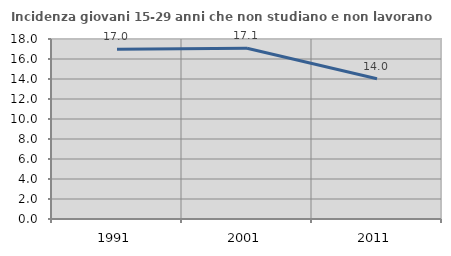
| Category | Incidenza giovani 15-29 anni che non studiano e non lavorano  |
|---|---|
| 1991.0 | 16.975 |
| 2001.0 | 17.073 |
| 2011.0 | 14.024 |